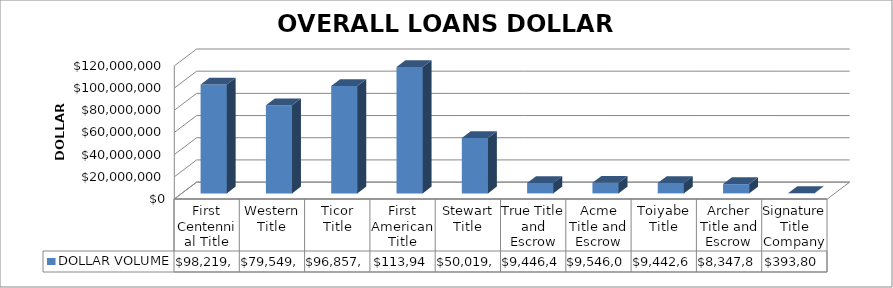
| Category | DOLLAR VOLUME |
|---|---|
| First Centennial Title | 98219831 |
| Western Title | 79549001 |
| Ticor Title | 96857270 |
| First American Title | 113949181.9 |
| Stewart Title | 50019933 |
| True Title and Escrow | 9446489 |
| Acme Title and Escrow | 9546093.69 |
| Toiyabe Title | 9442691 |
| Archer Title and Escrow | 8347814 |
| Signature Title Company | 393800 |